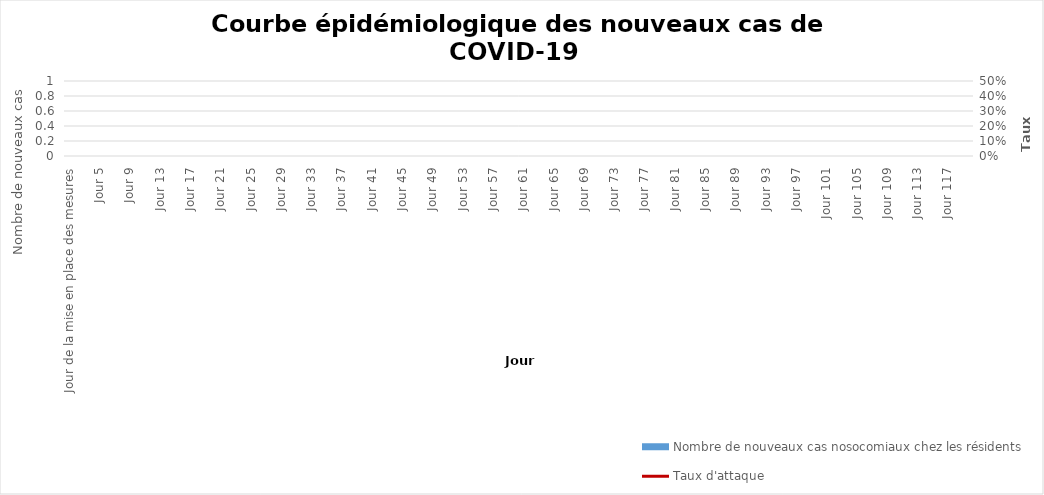
| Category | Nombre de nouveaux cas nosocomiaux chez les résidents |
|---|---|
| Jour de la mise en place des mesures | 0 |
| Jour 2 | 0 |
| Jour 3 | 0 |
| Jour 4 | 0 |
| Jour 5 | 0 |
| Jour 6 | 0 |
| Jour 7 | 0 |
| Jour 8 | 0 |
| Jour 9 | 0 |
| Jour 10 | 0 |
| Jour 11 | 0 |
| Jour 12 | 0 |
| Jour 13 | 0 |
| Jour 14 | 0 |
| Jour 15 | 0 |
| Jour 16 | 0 |
| Jour 17 | 0 |
| Jour 18 | 0 |
| Jour 19 | 0 |
| Jour 20 | 0 |
| Jour 21 | 0 |
| Jour 22 | 0 |
| Jour 23 | 0 |
| Jour 24 | 0 |
| Jour 25 | 0 |
| Jour 26 | 0 |
| Jour 27 | 0 |
| Jour 28 | 0 |
| Jour 29 | 0 |
| Jour 30 | 0 |
| Jour 31 | 0 |
| Jour 32 | 0 |
| Jour 33 | 0 |
| Jour 34 | 0 |
| Jour 35 | 0 |
| Jour 36 | 0 |
| Jour 37 | 0 |
| Jour 38 | 0 |
| Jour 39 | 0 |
| Jour 40 | 0 |
| Jour 41 | 0 |
| Jour 42 | 0 |
| Jour 43 | 0 |
| Jour 44 | 0 |
| Jour 45 | 0 |
| Jour 46 | 0 |
| Jour 47 | 0 |
| Jour 48 | 0 |
| Jour 49 | 0 |
| Jour 50 | 0 |
| Jour 51 | 0 |
| Jour 52 | 0 |
| Jour 53 | 0 |
| Jour 54 | 0 |
| Jour 55 | 0 |
| Jour 56 | 0 |
| Jour 57 | 0 |
| Jour 58 | 0 |
| Jour 59 | 0 |
| Jour 60 | 0 |
| Jour 61 | 0 |
| Jour 62 | 0 |
| Jour 63 | 0 |
| Jour 64 | 0 |
| Jour 65 | 0 |
| Jour 66 | 0 |
| Jour 67 | 0 |
| Jour 68 | 0 |
| Jour 69 | 0 |
| Jour 70 | 0 |
| Jour 71 | 0 |
| Jour 72 | 0 |
| Jour 73 | 0 |
| Jour 74 | 0 |
| Jour 75 | 0 |
| Jour 76 | 0 |
| Jour 77 | 0 |
| Jour 78 | 0 |
| Jour 79 | 0 |
| Jour 80 | 0 |
| Jour 81 | 0 |
| Jour 82 | 0 |
| Jour 83 | 0 |
| Jour 84 | 0 |
| Jour 85 | 0 |
| Jour 86 | 0 |
| Jour 87 | 0 |
| Jour 88 | 0 |
| Jour 89 | 0 |
| Jour 90 | 0 |
| Jour 91 | 0 |
| Jour 92 | 0 |
| Jour 93 | 0 |
| Jour 94 | 0 |
| Jour 95 | 0 |
| Jour 96 | 0 |
| Jour 97 | 0 |
| Jour 98 | 0 |
| Jour 99 | 0 |
| Jour 100 | 0 |
| Jour 101 | 0 |
| Jour 102 | 0 |
| Jour 103 | 0 |
| Jour 104 | 0 |
| Jour 105 | 0 |
| Jour 106 | 0 |
| Jour 107 | 0 |
| Jour 108 | 0 |
| Jour 109 | 0 |
| Jour 110 | 0 |
| Jour 111 | 0 |
| Jour 112 | 0 |
| Jour 113 | 0 |
| Jour 114 | 0 |
| Jour 115 | 0 |
| Jour 116 | 0 |
| Jour 117 | 0 |
| Jour 118 | 0 |
| Jour 119 | 0 |
| Jour 120 | 0 |